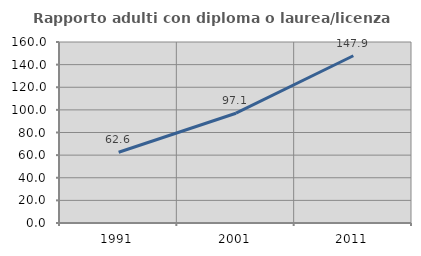
| Category | Rapporto adulti con diploma o laurea/licenza media  |
|---|---|
| 1991.0 | 62.553 |
| 2001.0 | 97.054 |
| 2011.0 | 147.859 |